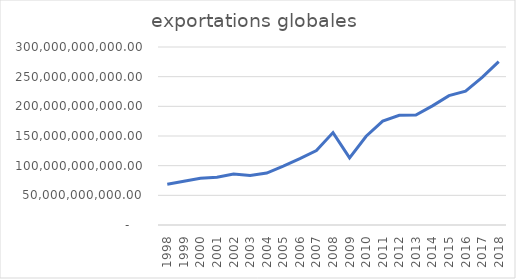
| Category | exportations globales  |
|---|---|
| 1998.0 | 68572308775 |
| 1999.0 | 73581121663 |
| 2000.0 | 78791639275 |
| 2001.0 | 80522294821 |
| 2002.0 | 86082815380 |
| 2003.0 | 83571367383 |
| 2004.0 | 87469915263 |
| 2005.0 | 99265205103 |
| 2006.0 | 111979259496 |
| 2007.0 | 125516873036 |
| 2008.0 | 155739873210 |
| 2009.0 | 113020000791 |
| 2010.0 | 149583350714 |
| 2011.0 | 174994471311.471 |
| 2012.0 | 184885214019.102 |
| 2013.0 | 185386907085.036 |
| 2014.0 | 200808045021.46 |
| 2015.0 | 218040445572.985 |
| 2016.0 | 225651082097.374 |
| 2017.0 | 248840818966.86 |
| 2018.0 | 275440533169.488 |